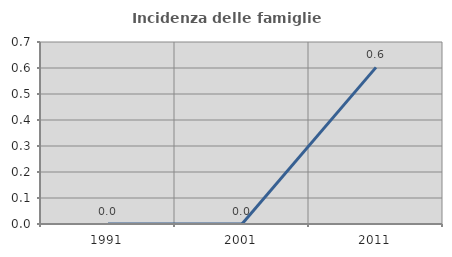
| Category | Incidenza delle famiglie numerose |
|---|---|
| 1991.0 | 0 |
| 2001.0 | 0 |
| 2011.0 | 0.602 |